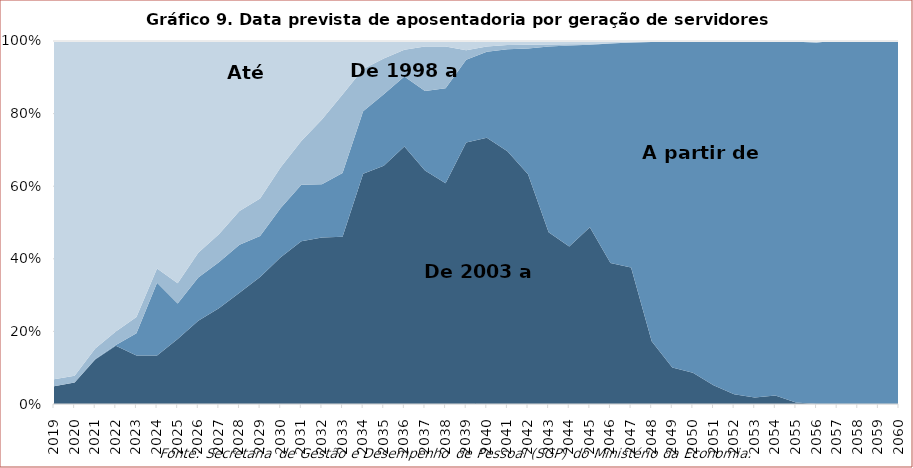
| Category | De 2003 a 2013 | A partir de 2013 | De 1998 a 2003 | Até 1998 |
|---|---|---|---|---|
| 2019.0 | 2999 | 13 | 1169 | 57421 |
| 2020.0 | 4086 | 3 | 1275 | 63650 |
| 2021.0 | 2237 | 26 | 525 | 15457 |
| 2022.0 | 2291 | 33 | 527 | 11428 |
| 2023.0 | 1879 | 861 | 627 | 10683 |
| 2024.0 | 2115 | 3174 | 628 | 9926 |
| 2025.0 | 2300 | 1254 | 715 | 8557 |
| 2026.0 | 2590 | 1350 | 766 | 6589 |
| 2027.0 | 2842 | 1365 | 828 | 5738 |
| 2028.0 | 3079 | 1329 | 928 | 4706 |
| 2029.0 | 3591 | 1155 | 1058 | 4453 |
| 2030.0 | 4028 | 1350 | 1119 | 3461 |
| 2031.0 | 4426 | 1534 | 1191 | 2716 |
| 2032.0 | 5067 | 1623 | 1964 | 2392 |
| 2033.0 | 5318 | 2030 | 2493 | 1705 |
| 2034.0 | 7457 | 2023 | 1371 | 907 |
| 2035.0 | 7840 | 2356 | 1172 | 578 |
| 2036.0 | 10590 | 2884 | 1096 | 363 |
| 2037.0 | 9530 | 3246 | 1810 | 228 |
| 2038.0 | 9766 | 4203 | 1847 | 247 |
| 2039.0 | 12382 | 3914 | 457 | 433 |
| 2040.0 | 13145 | 4245 | 258 | 277 |
| 2041.0 | 12090 | 4892 | 204 | 186 |
| 2042.0 | 9427 | 5168 | 155 | 150 |
| 2043.0 | 7589 | 8202 | 93 | 155 |
| 2044.0 | 6972 | 8897 | 51 | 144 |
| 2045.0 | 7223 | 7449 | 17 | 137 |
| 2046.0 | 4629 | 7215 | 2 | 77 |
| 2047.0 | 4214 | 6955 | 0 | 46 |
| 2048.0 | 1793 | 8550 | 2 | 30 |
| 2049.0 | 848 | 7556 | 2 | 24 |
| 2050.0 | 500 | 5302 | 1 | 12 |
| 2051.0 | 278 | 5068 | 0 | 7 |
| 2052.0 | 111 | 3989 | 0 | 1 |
| 2053.0 | 52 | 2815 | 0 | 1 |
| 2054.0 | 18 | 750 | 0 | 0 |
| 2055.0 | 2 | 456 | 0 | 1 |
| 2056.0 | 0 | 258 | 0 | 1 |
| 2057.0 | 0 | 107 | 0 | 0 |
| 2058.0 | 0 | 48 | 0 | 0 |
| 2059.0 | 0 | 13 | 0 | 0 |
| 2060.0 | 0 | 2 | 0 | 0 |